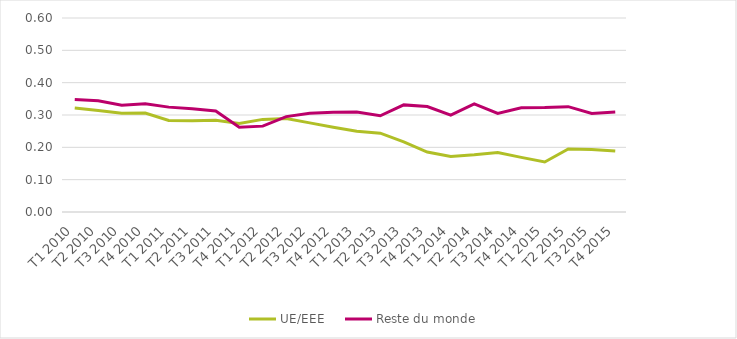
| Category | UE/EEE  | Reste du monde |
|---|---|---|
| T1 2010 | 0.321 | 0.348 |
| T2 2010 | 0.314 | 0.344 |
| T3 2010 | 0.305 | 0.33 |
| T4 2010 | 0.306 | 0.334 |
| T1 2011 | 0.283 | 0.324 |
| T2 2011 | 0.282 | 0.319 |
| T3 2011 | 0.283 | 0.312 |
| T4 2011 | 0.274 | 0.262 |
| T1 2012 | 0.286 | 0.266 |
| T2 2012 | 0.289 | 0.295 |
| T3 2012 | 0.276 | 0.305 |
| T4 2012 | 0.262 | 0.308 |
| T1 2013 | 0.25 | 0.309 |
| T2 2013 | 0.244 | 0.298 |
| T3 2013 | 0.217 | 0.331 |
| T4 2013 | 0.185 | 0.326 |
| T1 2014 | 0.172 | 0.3 |
| T2 2014 | 0.177 | 0.334 |
| T3 2014 | 0.184 | 0.305 |
| T4 2014 | 0.169 | 0.322 |
| T1 2015 | 0.155 | 0.323 |
| T2 2015 | 0.195 | 0.326 |
| T3 2015 | 0.193 | 0.305 |
| T4 2015 | 0.188 | 0.309 |